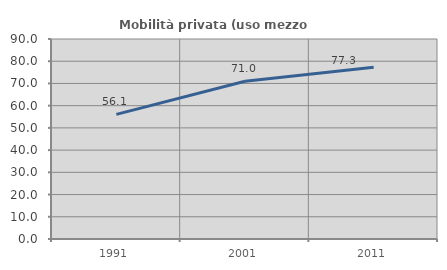
| Category | Mobilità privata (uso mezzo privato) |
|---|---|
| 1991.0 | 56.061 |
| 2001.0 | 70.982 |
| 2011.0 | 77.335 |